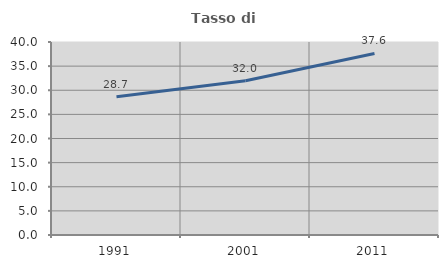
| Category | Tasso di occupazione   |
|---|---|
| 1991.0 | 28.658 |
| 2001.0 | 31.983 |
| 2011.0 | 37.622 |